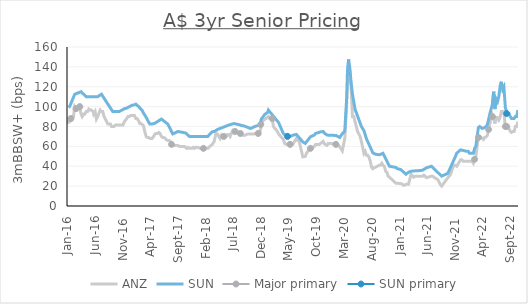
| Category | ANZ | SUN |
|---|---|---|
| 2022-10-13 | 85 | 96.5 |
| 2022-10-06 | 80 | 90 |
| 2022-09-29 | 80 | 90 |
| 2022-09-22 | 75 | 88 |
| 2022-09-15 | 75 | 88 |
| 2022-09-08 | 74 | 88 |
| 2022-09-01 | 75 | 90 |
| 2022-08-25 | 78 | 93 |
| 2022-08-19 | 79 | 93 |
| 2022-08-12 | 79 | 95 |
| 2022-08-05 | 79 | 99 |
| 2022-07-28 | 95 | 120 |
| 2022-07-21 | 95 | 117.5 |
| 2022-07-14 | 95 | 125 |
| 2022-07-07 | 89 | 120 |
| 2022-06-30 | 86.5 | 110 |
| 2022-06-23 | 89 | 105 |
| 2022-06-16 | 89 | 107.5 |
| 2022-06-09 | 83 | 97.5 |
| 2022-06-02 | 88.5 | 115 |
| 2022-05-26 | 90 | 102.5 |
| 2022-05-19 | 95 | 97.75 |
| 2022-05-12 | 83 | 93 |
| 2022-05-05 | 77 | 87 |
| 2022-04-28 | 71 | 82 |
| 2022-04-21 | 69.5 | 80 |
| 2022-04-13 | 69 | 79 |
| 2022-04-07 | 67 | 78.5 |
| 2022-03-31 | 68 | 78 |
| 2022-03-24 | 69 | 79 |
| 2022-03-17 | 70 | 80 |
| 2022-03-10 | 69 | 79 |
| 2022-03-03 | 60 | 70 |
| 2022-02-24 | 50 | 60 |
| 2022-02-17 | 47 | 58 |
| 2022-02-10 | 43 | 53 |
| 2022-02-03 | 45 | 53 |
| 2022-01-20 | 45 | 53 |
| 2022-01-13 | 45 | 55 |
| 2022-01-06 | 45 | 55 |
| 2021-12-29 | 45 | 55.3 |
| 2021-12-22 | 45 | 55.6 |
| 2021-12-16 | 45 | 55.9 |
| 2021-12-09 | 46.5 | 56.2 |
| 2021-12-02 | 46.5 | 56.5 |
| 2021-11-11 | 40 | 53.25 |
| 2021-11-04 | 41 | 50 |
| 2021-10-28 | 41 | 47.143 |
| 2021-10-21 | 39 | 44.286 |
| 2021-10-14 | 35 | 41.429 |
| 2021-10-07 | 31.5 | 38.571 |
| 2021-09-30 | 30 | 35.714 |
| 2021-09-23 | 28.5 | 32.857 |
| 2021-08-20 | 20 | 30 |
| 2021-08-13 | 21.5 | 31.25 |
| 2021-08-06 | 24 | 32.5 |
| 2021-07-30 | 26.5 | 33.75 |
| 2021-07-23 | 27.5 | 35 |
| 2021-07-16 | 28 | 36.25 |
| 2021-07-09 | 29 | 37.5 |
| 2021-07-02 | 30 | 38.75 |
| 2021-06-25 | 30 | 40 |
| 2021-06-21 | 29 | 39.2 |
| 2021-05-28 | 28.5 | 38.4 |
| 2021-05-21 | 30 | 37.6 |
| 2021-05-14 | 31 | 36.8 |
| 2021-05-07 | 30 | 36 |
| 2021-04-30 | 30 | 35.833 |
| 2021-04-23 | 30 | 35.667 |
| 2021-04-09 | 30 | 35.5 |
| 2021-03-26 | 30 | 35.333 |
| 2021-03-19 | 29 | 35.167 |
| 2021-03-05 | 32 | 35 |
| 2021-02-19 | 22 | 34 |
| 2021-02-12 | 22 | 33 |
| 2021-02-05 | 22 | 32 |
| 2021-01-29 | 21 | 33.143 |
| 2021-01-22 | 21 | 34.286 |
| 2021-01-15 | 22 | 35.429 |
| 2021-01-08 | 22.5 | 36.571 |
| 2020-12-18 | 23 | 37.714 |
| 2020-12-11 | 23 | 38.857 |
| 2020-11-06 | 29 | 40 |
| 2020-10-30 | 30 | 42.6 |
| 2020-10-23 | 34 | 45.2 |
| 2020-10-16 | 35 | 47.8 |
| 2020-10-09 | 40 | 50.4 |
| 2020-10-02 | 41 | 53 |
| 2020-09-25 | 43 | 52.5 |
| 2020-09-18 | 41 | 52 |
| 2020-09-11 | 41 | 51.5 |
| 2020-08-21 | 39 | 52.167 |
| 2020-08-14 | 38.5 | 52.833 |
| 2020-08-07 | 37.5 | 53.5 |
| 2020-07-31 | 39 | 56.3 |
| 2020-07-24 | 45 | 59.1 |
| 2020-07-17 | 49 | 61.9 |
| 2020-07-10 | 51 | 64.7 |
| 2020-07-03 | 51 | 67.5 |
| 2020-06-26 | 55 | 71.667 |
| 2020-06-19 | 53 | 75.833 |
| 2020-06-05 | 65 | 80 |
| 2020-05-29 | 70 | 83.5 |
| 2020-05-22 | 72.5 | 87 |
| 2020-05-15 | 75 | 90.5 |
| 2020-05-08 | 80 | 94 |
| 2020-05-01 | 85 | 97.5 |
| 2020-04-24 | 90 | 105 |
| 2020-04-17 | 90 | 112.5 |
| 2020-04-09 | 120 | 125.25 |
| 2020-04-03 | 135 | 138 |
| 2020-03-27 | 135 | 147.5 |
| 2020-03-20 | 120 | 132.5 |
| 2020-03-16 | 102.5 | 108 |
| 2020-03-06 | 68 | 76.5 |
| 2020-03-03 | 68.5 | 74.625 |
| 2020-02-21 | 55.5 | 72.75 |
| 2020-02-14 | 57.5 | 70.875 |
| 2020-02-07 | 59.5 | 69 |
| 2020-01-31 | 61 | 69.667 |
| 2020-01-24 | 61 | 70.333 |
| 2020-01-17 | 62.5 | 71 |
| 2019-12-06 | 63 | 71.25 |
| 2019-11-29 | 61 | 71.5 |
| 2019-11-15 | 62.5 | 73.25 |
| 2019-11-08 | 65 | 75 |
| 2019-10-25 | 63 | 74.6 |
| 2019-10-18 | 62 | 74.2 |
| 2019-10-11 | 62 | 73.8 |
| 2019-10-04 | 62 | 73.4 |
| 2019-09-27 | 62 | 73 |
| 2019-09-20 | 60 | 71.333 |
| 2019-08-30 | 57.5 | 69.667 |
| 2019-08-23 | 58 | 68 |
| 2019-08-16 | 55 | 66.333 |
| 2019-08-09 | 53.5 | 64.667 |
| 2019-08-02 | 50 | 63 |
| 2019-07-19 | 49.5 | 64.5 |
| 2019-07-12 | 55 | 66 |
| 2019-07-05 | 60.5 | 67.5 |
| 2019-06-28 | 66 | 69 |
| 2019-06-21 | 66 | 70.5 |
| 2019-06-14 | 68 | 72 |
| 2019-05-31 | 64 | 71.5 |
| 2019-05-24 | 62 | 71 |
| 2019-05-17 | 62 | 70.5 |
| 2019-05-10 | 62 | 70 |
| 2019-04-26 | 62 | 72 |
| 2019-04-12 | 62.5 | 71.5 |
| 2019-04-03 | 67 | 73 |
| 2019-03-08 | 72.5 | 84 |
| 2019-03-01 | 75 | 85.562 |
| 2019-02-22 | 77 | 87.125 |
| 2019-02-15 | 78 | 88.687 |
| 2019-02-08 | 80 | 90.25 |
| 2019-02-01 | 88 | 91.812 |
| 2019-01-25 | 88 | 93.375 |
| 2019-01-18 | 88 | 94.937 |
| 2019-01-11 | 90 | 96.5 |
| 2019-01-07 | 90 | 94.25 |
| 2018-12-21 | 87 | 92 |
| 2018-12-13 | 86 | 89.75 |
| 2018-12-03 | 82 | 87.5 |
| 2018-11-30 | 78 | 84.5 |
| 2018-11-23 | 73 | 81.5 |
| 2018-11-16 | 73 | 80.917 |
| 2018-11-02 | 73 | 80.333 |
| 2018-10-26 | 72.5 | 79.75 |
| 2018-10-19 | 72.5 | 79.167 |
| 2018-10-12 | 72.5 | 78.583 |
| 2018-10-05 | 72.5 | 78 |
| 2018-09-28 | 72.5 | 78.5 |
| 2018-09-21 | 72.5 | 79 |
| 2018-09-17 | 71.5 | 79.5 |
| 2018-09-07 | 71.5 | 80 |
| 2018-08-31 | 71 | 80.5 |
| 2018-08-17 | 71.5 | 81 |
| 2018-08-10 | 73 | 81.5 |
| 2018-08-03 | 72 | 81.8 |
| 2018-07-27 | 74 | 82.1 |
| 2018-07-20 | 74 | 82.4 |
| 2018-07-12 | 75 | 82.7 |
| 2018-07-06 | 75 | 83 |
| 2018-06-29 | 76 | 82.625 |
| 2018-06-22 | 73 | 82.25 |
| 2018-06-15 | 70 | 81.875 |
| 2018-06-08 | 72 | 81.5 |
| 2018-06-01 | 72 | 81 |
| 2018-05-25 | 70 | 80.5 |
| 2018-05-18 | 70 | 80 |
| 2018-05-11 | 70 | 79.5 |
| 2018-05-04 | 69 | 79 |
| 2018-04-27 | 71 | 78.5 |
| 2018-04-20 | 68 | 78 |
| 2018-04-06 | 72.5 | 77 |
| 2018-03-29 | 73 | 76 |
| 2018-03-19 | 65 | 75 |
| 2018-03-09 | 62 | 74.75 |
| 2018-03-05 | 62 | 74.5 |
| 2018-02-23 | 60 | 72.25 |
| 2018-02-12 | 58 | 70 |
| 2018-02-02 | 58 | 70 |
| 2018-01-19 | 58 | 70 |
| 2018-01-12 | 58 | 70 |
| 2018-01-05 | 58 | 70 |
| 2017-12-15 | 59 | 70 |
| 2017-12-08 | 59 | 70 |
| 2017-12-01 | 58 | 70 |
| 2017-11-24 | 59 | 70 |
| 2017-11-17 | 58 | 70 |
| 2017-11-10 | 58 | 70 |
| 2017-11-03 | 58 | 70 |
| 2017-10-27 | 59 | 71.167 |
| 2017-10-20 | 58 | 72.333 |
| 2017-10-13 | 59 | 73.5 |
| 2017-10-06 | 60 | 73.75 |
| 2017-09-29 | 60 | 74 |
| 2017-09-22 | 60 | 74.25 |
| 2017-09-18 | 60 | 74.5 |
| 2017-09-08 | 60 | 74.75 |
| 2017-09-01 | 61 | 75 |
| 2017-08-25 | 61 | 74.375 |
| 2017-08-18 | 61 | 73.75 |
| 2017-08-11 | 61 | 73.125 |
| 2017-08-04 | 61 | 72.5 |
| 2017-07-28 | 61 | 75 |
| 2017-07-21 | 65 | 77.5 |
| 2017-07-14 | 66 | 80 |
| 2017-07-07 | 66 | 82.5 |
| 2017-06-30 | 66.5 | 83.5 |
| 2017-06-23 | 68 | 84.5 |
| 2017-06-16 | 69 | 85.5 |
| 2017-06-09 | 69 | 86.5 |
| 2017-06-02 | 70 | 87.5 |
| 2017-05-26 | 73 | 86.667 |
| 2017-05-19 | 74 | 85.833 |
| 2017-05-12 | 73 | 85 |
| 2017-05-05 | 73 | 84.167 |
| 2017-04-28 | 72.5 | 83.333 |
| 2017-04-24 | 71 | 82.5 |
| 2017-04-12 | 68 | 82.5 |
| 2017-04-07 | 68 | 82.5 |
| 2017-03-31 | 68 | 82.5 |
| 2017-03-23 | 69 | 84.75 |
| 2017-03-17 | 69 | 87 |
| 2017-03-10 | 70 | 89.25 |
| 2017-03-03 | 75 | 91.5 |
| 2017-02-23 | 81 | 93.75 |
| 2017-02-17 | 82 | 96 |
| 2017-02-10 | 83 | 97.3 |
| 2017-02-03 | 83 | 98.6 |
| 2017-01-30 | 85 | 99.9 |
| 2017-01-20 | 88 | 101.2 |
| 2017-01-13 | 88 | 102.5 |
| 2017-01-05 | 91 | 101.875 |
| 2016-12-21 | 91 | 101.25 |
| 2016-12-15 | 91 | 100.625 |
| 2016-12-08 | 90 | 100 |
| 2016-12-01 | 90 | 99.286 |
| 2016-11-24 | 88 | 98.571 |
| 2016-11-11 | 85 | 97.857 |
| 2016-11-03 | 81.5 | 97.143 |
| 2016-10-28 | 81.5 | 96.429 |
| 2016-10-20 | 81.5 | 95.714 |
| 2016-10-13 | 81.5 | 95 |
| 2016-10-07 | 81.5 | 95 |
| 2016-09-29 | 81.5 | 95 |
| 2016-09-22 | 81.5 | 95 |
| 2016-09-15 | 80 | 95 |
| 2016-09-08 | 80 | 95 |
| 2016-09-01 | 80 | 96.875 |
| 2016-08-26 | 82.5 | 98.75 |
| 2016-08-19 | 82.5 | 100.625 |
| 2016-08-12 | 82.5 | 102.5 |
| 2016-08-05 | 85 | 104.5 |
| 2016-07-29 | 87.5 | 106.5 |
| 2016-07-22 | 90 | 108.5 |
| 2016-07-15 | 95 | 110.5 |
| 2016-07-08 | 95 | 112.5 |
| 2016-07-01 | 96.5 | 111.667 |
| 2016-06-29 | 97.5 | 110.833 |
| 2016-06-17 | 90 | 110 |
| 2016-06-10 | 87.5 | 110 |
| 2016-06-03 | 95 | 110 |
| 2016-05-26 | 92.5 | 110 |
| 2016-05-23 | 95 | 110 |
| 2016-05-13 | 96.5 | 110 |
| 2016-05-06 | 96.5 | 110 |
| 2016-04-29 | 97.5 | 110 |
| 2016-04-22 | 95 | 110 |
| 2016-04-15 | 95 | 110 |
| 2016-04-08 | 92.5 | 111.25 |
| 2016-04-01 | 92.5 | 112.5 |
| 2016-03-24 | 90 | 113.75 |
| 2016-03-18 | 92.5 | 115 |
| 2016-03-11 | 98 | 114.5 |
| 2016-03-04 | 100.5 | 114 |
| 2016-02-26 | 99 | 113.5 |
| 2016-02-19 | 98 | 113 |
| 2016-02-12 | 100 | 112.5 |
| 2016-02-05 | 90 | 109.375 |
| 2016-01-29 | 90 | 106.25 |
| 2016-01-22 | 88 | 103.125 |
| 2016-01-15 | 85 | 100 |
| 2016-01-08 | 85 | 99.375 |
| 2016-01-05 | 82.5 | 98.75 |